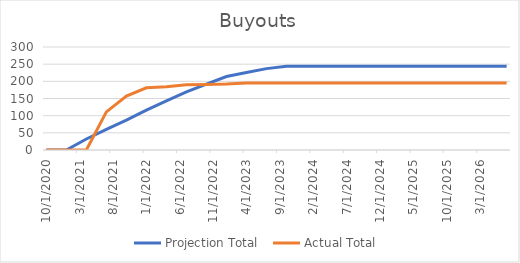
| Category | Projection Total  | Actual Total  |
|---|---|---|
| 10/1/20 | 0 | 0 |
| 1/1/21 | 0 | 0 |
| 4/1/21 | 32 | 0 |
| 7/1/21 | 60 | 111 |
| 10/1/21 | 87 | 157 |
| 1/1/22 | 116 | 181 |
| 4/1/22 | 143 | 184 |
| 7/1/22 | 169 | 190 |
| 10/1/22 | 192 | 191 |
| 1/1/23 | 214 | 192 |
| 4/1/23 | 226 | 195 |
| 7/1/23 | 237 | 195 |
| 10/1/23 | 244 | 195 |
| 1/1/24 | 244 | 195 |
| 4/1/24 | 244 | 195 |
| 7/1/24 | 244 | 195 |
| 10/1/24 | 244 | 195 |
| 1/1/25 | 244 | 195 |
| 4/1/25 | 244 | 195 |
| 7/1/25 | 244 | 195 |
| 10/1/25 | 244 | 195 |
| 1/1/26 | 244 | 195 |
| 4/1/26 | 244 | 195 |
| 7/1/26 | 244 | 195 |